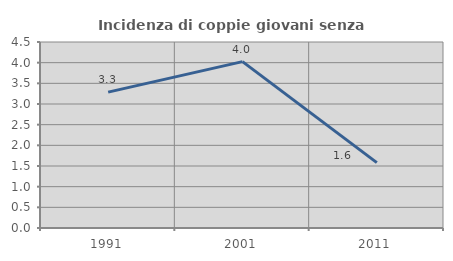
| Category | Incidenza di coppie giovani senza figli |
|---|---|
| 1991.0 | 3.288 |
| 2001.0 | 4.026 |
| 2011.0 | 1.582 |